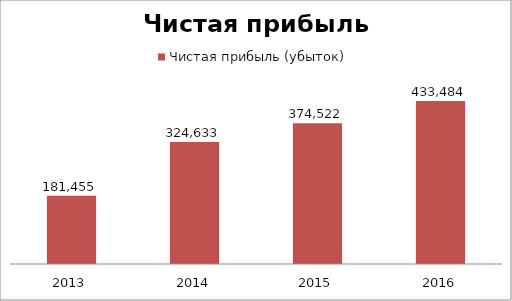
| Category | Чистая прибыль (убыток) |
|---|---|
| 2013.0 | 181455.36 |
| 2014.0 | 324632.959 |
| 2015.0 | 374522.148 |
| 2016.0 | 433483.613 |